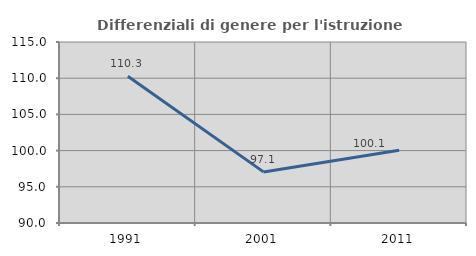
| Category | Differenziali di genere per l'istruzione superiore |
|---|---|
| 1991.0 | 110.265 |
| 2001.0 | 97.059 |
| 2011.0 | 100.053 |